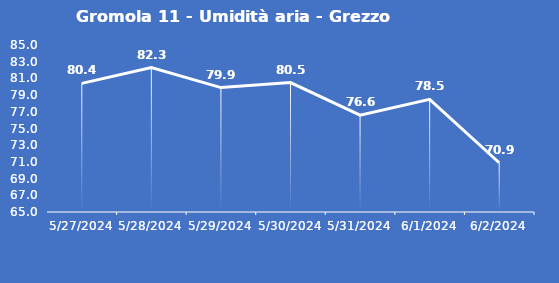
| Category | Gromola 11 - Umidità aria - Grezzo (%) |
|---|---|
| 5/27/24 | 80.4 |
| 5/28/24 | 82.3 |
| 5/29/24 | 79.9 |
| 5/30/24 | 80.5 |
| 5/31/24 | 76.6 |
| 6/1/24 | 78.5 |
| 6/2/24 | 70.9 |